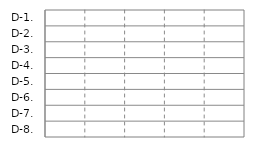
| Category | IN | OUT |
|---|---|---|
| D-1. | 0 | 0 |
| D-2. | 0 | 0 |
| D-3. | 0 | 0 |
| D-4. | 0 | 0 |
| D-5. | 0 | 0 |
| D-6. | 0 | 0 |
| D-7. | 0 | 0 |
| D-8. | 0 | 0 |